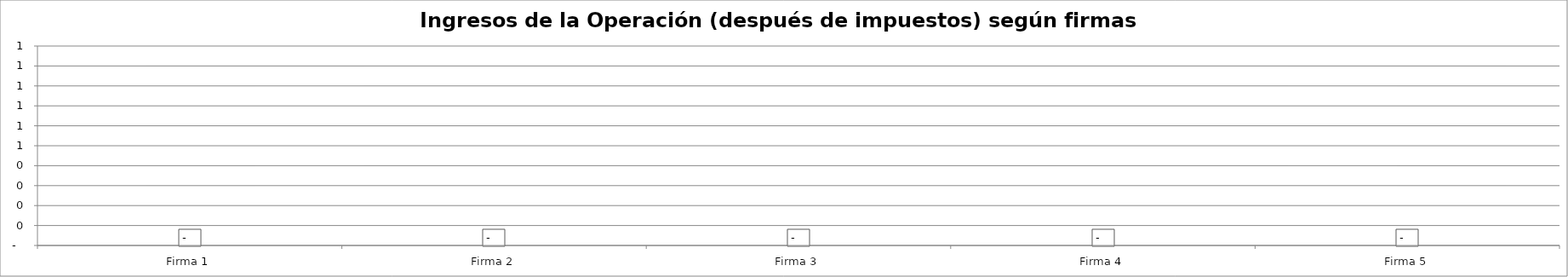
| Category | Ingresos de la Operación (después de impuestos) según firmas simuladas - Año 7 |
|---|---|
| Firma 1 | 0 |
| Firma 2 | 0 |
| Firma 3 | 0 |
| Firma 4 | 0 |
| Firma 5 | 0 |